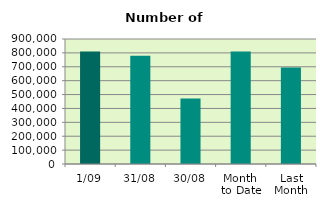
| Category | Series 0 |
|---|---|
| 1/09 | 809784 |
| 31/08 | 778556 |
| 30/08 | 472380 |
| Month 
to Date | 809784 |
| Last
Month | 695004.455 |